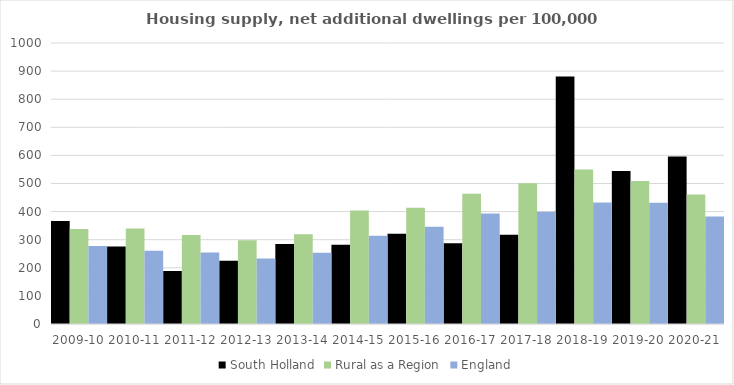
| Category | South Holland | Rural as a Region | England |
|---|---|---|---|
| 2009-10 | 366.262 | 337.852 | 277.548 |
| 2010-11 | 275.98 | 340.105 | 260.994 |
| 2011-12 | 188.935 | 317.04 | 254.007 |
| 2012-13 | 224.742 | 297.763 | 233.153 |
| 2013-14 | 284.804 | 319.835 | 253.602 |
| 2014-15 | 282.136 | 403.796 | 314.256 |
| 2015-16 | 321.113 | 414.091 | 346.154 |
| 2016-17 | 287.484 | 463.209 | 393.256 |
| 2017-18 | 317.273 | 500.68 | 399.646 |
| 2018-19 | 881.039 | 549.491 | 432.099 |
| 2019-20 | 544.102 | 508.493 | 431.187 |
| 2020-21 | 595.679 | 461.114 | 382.827 |